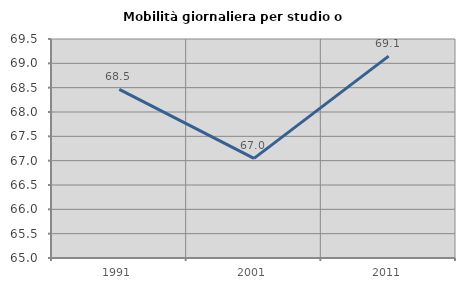
| Category | Mobilità giornaliera per studio o lavoro |
|---|---|
| 1991.0 | 68.466 |
| 2001.0 | 67.048 |
| 2011.0 | 69.147 |